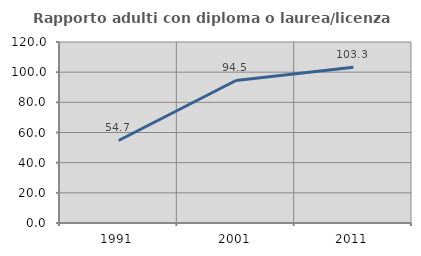
| Category | Rapporto adulti con diploma o laurea/licenza media  |
|---|---|
| 1991.0 | 54.707 |
| 2001.0 | 94.487 |
| 2011.0 | 103.25 |